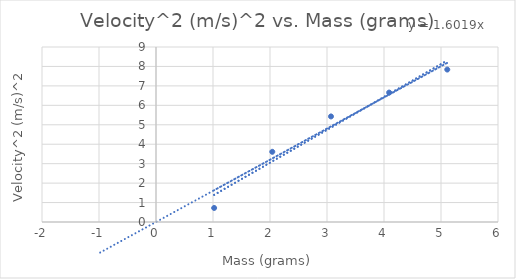
| Category | Velocity^2 (m/s)^2 |
|---|---|
| 1.02 | 0.722 |
| 2.04 | 3.61 |
| 3.07 | 5.429 |
| 4.09 | 6.656 |
| 5.11 | 7.84 |